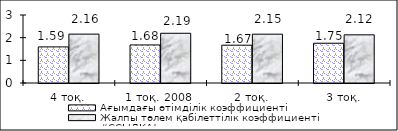
| Category | Ағымдағы өтімділік коэффициенті | Жалпы төлем қабілеттілік коэффициенті |
|---|---|---|
| 4 тоқ. | 1.593 | 2.156 |
| 1 тоқ. 2008  | 1.679 | 2.194 |
| 2 тоқ. | 1.668 | 2.154 |
| 3 тоқ. | 1.755 | 2.125 |